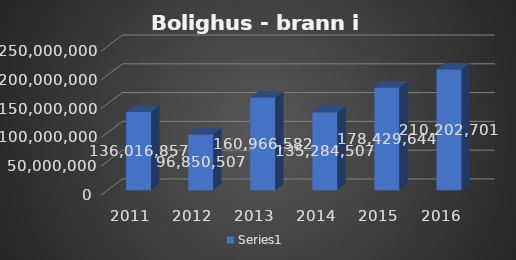
| Category | Series 2 |
|---|---|
| 2011.0 | 136016856.75 |
| 2012.0 | 96850507.13 |
| 2013.0 | 160966581.86 |
| 2014.0 | 135284507.13 |
| 2015.0 | 178429643.67 |
| 2016.0 | 210202700.535 |